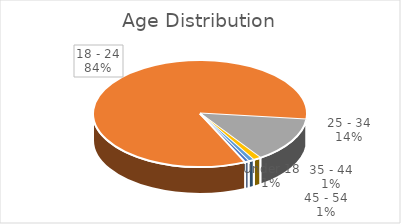
| Category | Series 0 |
|---|---|
| Under 18 | 2 |
| 18 - 24 | 292 |
| 25 - 34 | 48 |
| 35 - 44 | 4 |
| 45 - 54 | 3 |